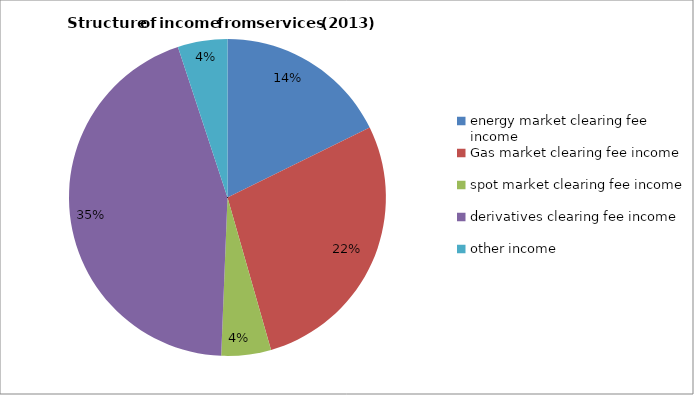
| Category | Series 0 |
|---|---|
| energy market clearing fee income | 0.14 |
| Gas market clearing fee income | 0.22 |
| spot market clearing fee income | 0.04 |
| derivatives clearing fee income | 0.35 |
| other income | 0.04 |